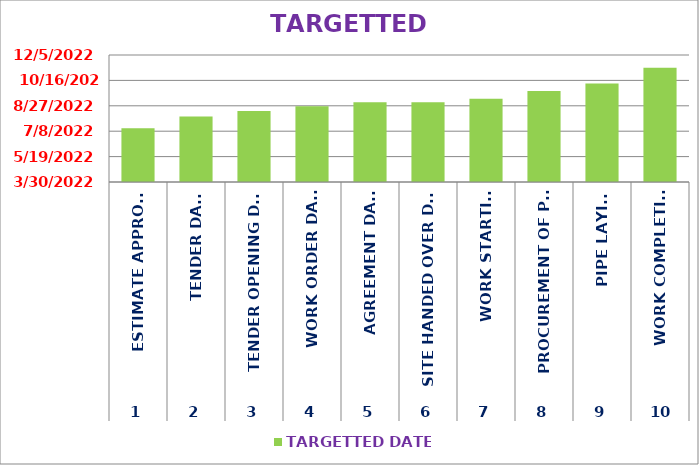
| Category | TARGETTED DATE |
|---|---|
| 0 | 7/14/22 |
| 1 | 8/6/22 |
| 2 | 8/17/22 |
| 3 | 8/26/22 |
| 4 | 9/3/22 |
| 5 | 9/3/22 |
| 6 | 9/10/22 |
| 7 | 9/25/22 |
| 8 | 10/10/22 |
| 9 | 11/10/22 |